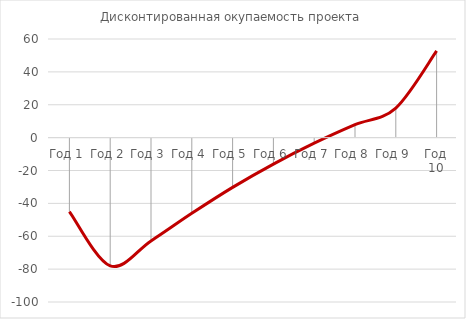
| Category | Дисконтированная окупаемость проекта |
|---|---|
| Год 1 | -45 |
| Год 2 | -78.011 |
| Год 3 | -62.823 |
| Год 4 | -46.05 |
| Год 5 | -30.254 |
| Год 6 | -16.091 |
| Год 7 | -3.395 |
| Год 8 | 7.874 |
| Год 9 | 17.978 |
| Год 10 | 52.724 |